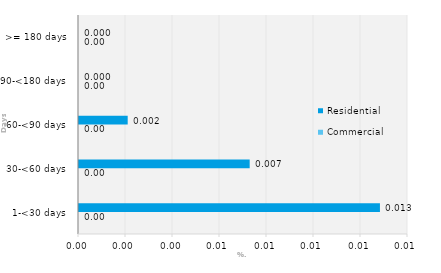
| Category | Commercial | Residential |
|---|---|---|
| 1-<30 days | 0 | 0.013 |
| 30-<60 days | 0 | 0.007 |
| 60-<90 days | 0 | 0.002 |
| 90-<180 days | 0 | 0 |
| >= 180 days | 0 | 0 |